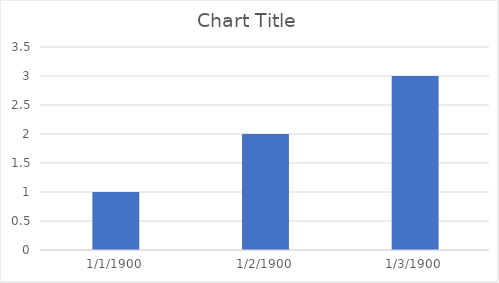
| Category | Series 0 |
|---|---|
| 1/1/00 | 1 |
| 1/2/00 | 2 |
| 1/3/00 | 3 |